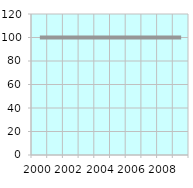
| Category | No. of  Paid Employees |
|---|---|
| 2000.0 | 100 |
| 2001.0 | 100 |
| 2002.0 | 100 |
| 2003.0 | 100 |
| 2004.0 | 100 |
| 2005.0 | 100 |
| 2006.0 | 100 |
| 2007.0 | 100 |
| 2008.0 | 100 |
| 2009.0 | 100 |